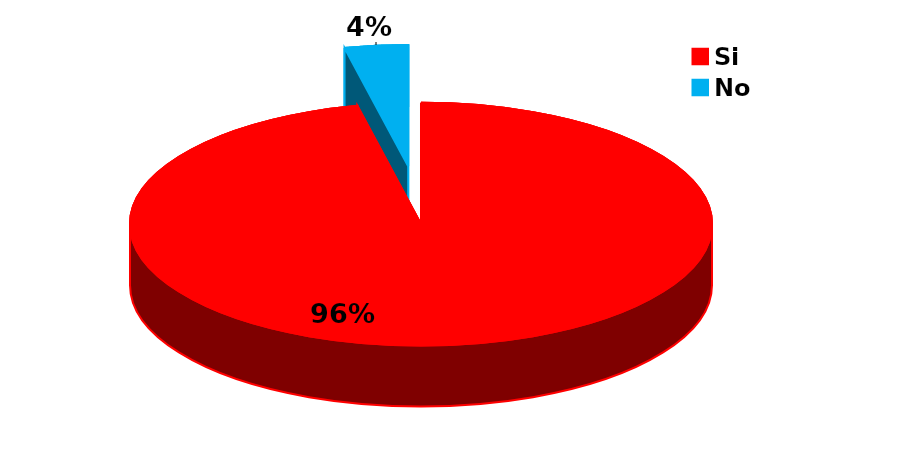
| Category | Series 0 |
|---|---|
| Si | 55 |
| No | 2 |